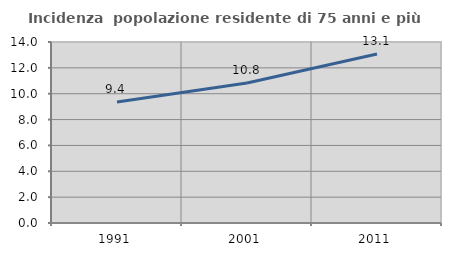
| Category | Incidenza  popolazione residente di 75 anni e più |
|---|---|
| 1991.0 | 9.362 |
| 2001.0 | 10.831 |
| 2011.0 | 13.067 |